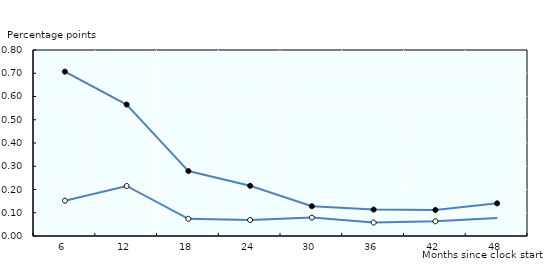
| Category | All jobs | Non-subsididsed jobs only |
|---|---|---|
| 6.0 | 0.707 | 0.152 |
| 12.0 | 0.565 | 0.215 |
| 18.0 | 0.279 | 0.074 |
| 24.0 | 0.216 | 0.069 |
| 30.0 | 0.128 | 0.079 |
| 36.0 | 0.114 | 0.058 |
| 42.0 | 0.112 | 0.063 |
| 48.0 | 0.14 | 0.078 |